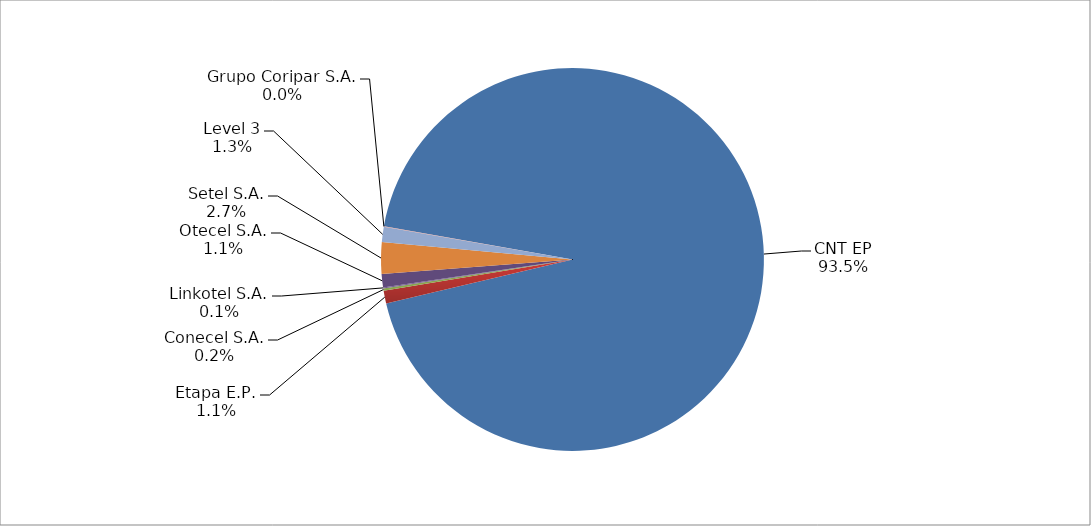
| Category | Series 0 |
|---|---|
| CNT EP | 2272 |
| Etapa E.P. | 26 |
| Conecel S.A. | 5 |
| Linkotel S.A. | 2 |
| Otecel S.A. | 27 |
| Setel S.A. | 65 |
| Level 3 | 31 |
| Grupo Coripar S.A. | 1 |